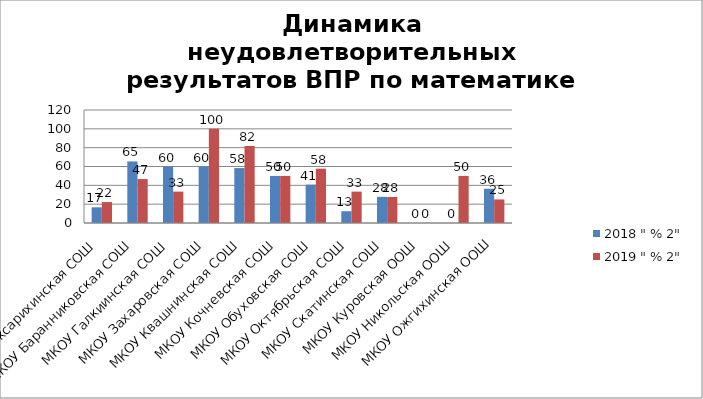
| Category | 2018 " % 2" | 2019 " % 2" |
|---|---|---|
| МКОУ Аксарихинская СОШ | 16.667 | 22.222 |
| МКОУ Баранниковская СОШ | 65.385 | 46.667 |
| МКОУ Галкиинская СОШ | 60 | 33.333 |
| МКОУ Захаровская СОШ | 60 | 100 |
| МКОУ Квашнинская СОШ | 58.333 | 81.818 |
| МКОУ Кочневская СОШ | 50 | 50 |
| МКОУ Обуховская СОШ | 40.741 | 57.692 |
| МКОУ Октябрьская СОШ | 12.5 | 33.333 |
| МКОУ Скатинская СОШ | 27.778 | 27.586 |
| МКОУ Куровская ООШ | 0 | 0 |
| МКОУ Никольская ООШ | 0 | 50 |
| МКОУ Ожгихинская ООШ | 36.364 | 25 |